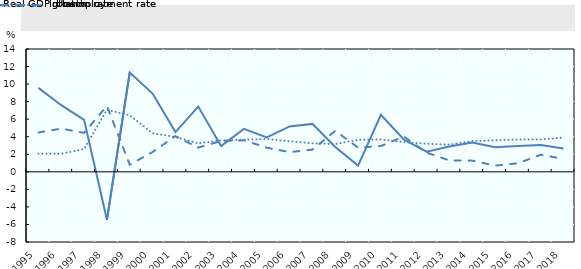
| Category | Real GDP growth | Inflation rate | Unemployment rate |
|---|---|---|---|
| 1995.0 | 9.571 | 4.481 | 2.067 |
| 1996.0 | 7.595 | 4.925 | 2.057 |
| 1997.0 | 5.922 | 4.439 | 2.603 |
| 1998.0 | -5.471 | 7.513 | 7.074 |
| 1999.0 | 11.309 | 0.813 | 6.443 |
| 2000.0 | 8.924 | 2.259 | 4.4 |
| 2001.0 | 4.525 | 4.066 | 3.966 |
| 2002.0 | 7.432 | 2.763 | 3.254 |
| 2003.0 | 2.933 | 3.515 | 3.573 |
| 2004.0 | 4.9 | 3.591 | 3.66 |
| 2005.0 | 3.924 | 2.754 | 3.738 |
| 2006.0 | 5.176 | 2.242 | 3.482 |
| 2007.0 | 5.463 | 2.535 | 3.25 |
| 2008.0 | 2.829 | 4.674 | 3.169 |
| 2009.0 | 0.708 | 2.757 | 3.648 |
| 2010.0 | 6.497 | 2.939 | 3.695 |
| 2011.0 | 3.682 | 4.026 | 3.386 |
| 2012.0 | 2.292 | 2.187 | 3.2 |
| 2013.0 | 2.896 | 1.301 | 3.102 |
| 2014.0 | 3.341 | 1.275 | 3.501 |
| 2015.0 | 2.79 | 0.706 | 3.594 |
| 2016.0 | 2.929 | 0.972 | 3.682 |
| 2017.0 | 3.063 | 1.944 | 3.684 |
| 2018.0 | 2.656 | 1.477 | 3.911 |